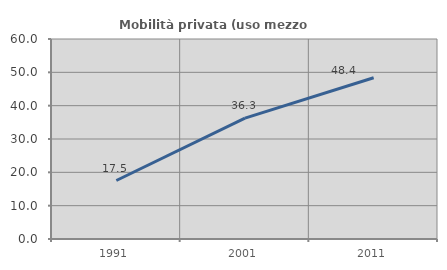
| Category | Mobilità privata (uso mezzo privato) |
|---|---|
| 1991.0 | 17.549 |
| 2001.0 | 36.261 |
| 2011.0 | 48.374 |